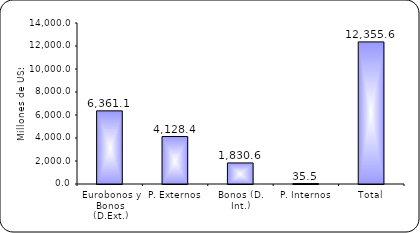
| Category | Series 1 |
|---|---|
| Eurobonos y Bonos (D.Ext.) | 6361.1 |
| P. Externos | 4128.4 |
| Bonos (D. Int.) | 1830.6 |
| P. Internos | 35.5 |
| Total | 12355.6 |